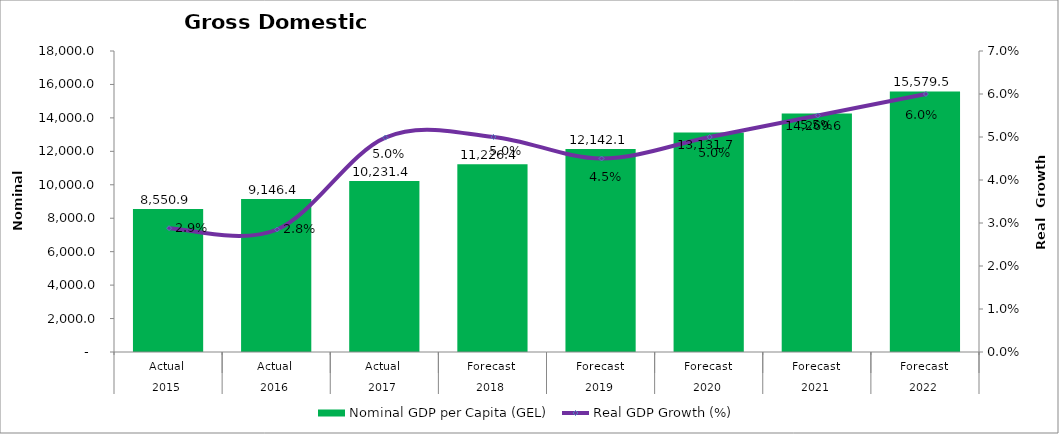
| Category | Nominal GDP per Capita (GEL) |
|---|---|
| 0 | 8550.921 |
| 1 | 9146.45 |
| 2 | 10231.353 |
| 3 | 11226.353 |
| 4 | 12142.14 |
| 5 | 13131.726 |
| 6 | 14269.593 |
| 7 | 15579.54 |